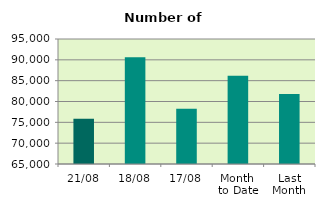
| Category | Series 0 |
|---|---|
| 21/08 | 75840 |
| 18/08 | 90618 |
| 17/08 | 78236 |
| Month 
to Date | 86192.667 |
| Last
Month | 81818 |